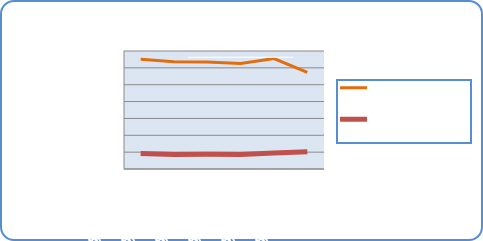
| Category | Motorin Türleri  | Benzin Türleri |
|---|---|---|
| 6/18/18 | 65139089.827 | 9171491.262 |
| 6/19/18 | 63688517.063 | 8588552.192 |
| 6/20/18 | 63497808.745 | 8686224.256 |
| 6/21/18 | 62563836.476 | 8657569.909 |
| 6/22/18 | 65526570.851 | 9457930.709 |
| 6/23/18 | 57379294.291 | 10177850.281 |